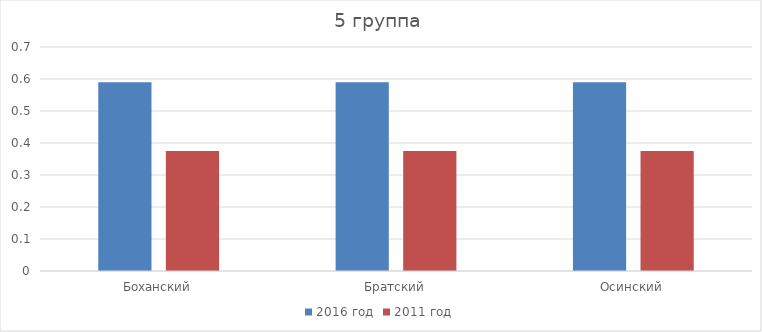
| Category | 2016 год | 2011 год |
|---|---|---|
| Боханский | 0.59 | 0.375 |
| Братский | 0.59 | 0.375 |
| Осинский | 0.59 | 0.375 |